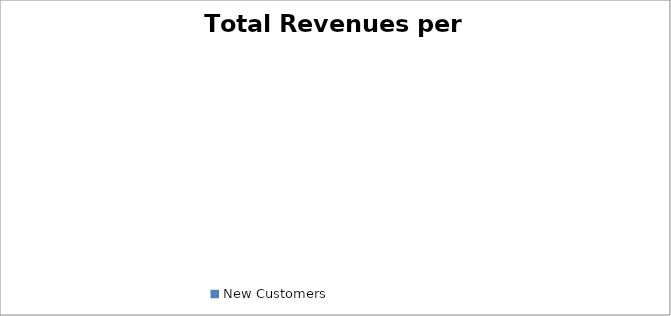
| Category | Total Revenues |
|---|---|
| New Customers | 0.535 |
| Existing Customers | 0.465 |